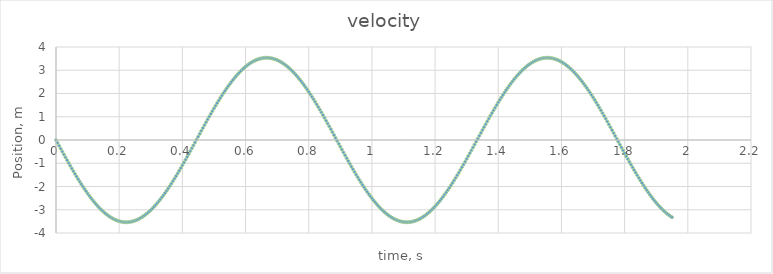
| Category | velocity |
|---|---|
| 0.0 | 0 |
| 0.005 | -0.125 |
| 0.01 | -0.25 |
| 0.015 | -0.374 |
| 0.02 | -0.498 |
| 0.025 | -0.622 |
| 0.030000000000000002 | -0.745 |
| 0.035 | -0.866 |
| 0.04 | -0.987 |
| 0.045 | -1.106 |
| 0.049999999999999996 | -1.224 |
| 0.05499999999999999 | -1.341 |
| 0.05999999999999999 | -1.456 |
| 0.06499999999999999 | -1.569 |
| 0.06999999999999999 | -1.68 |
| 0.075 | -1.789 |
| 0.08 | -1.895 |
| 0.085 | -2 |
| 0.09000000000000001 | -2.102 |
| 0.09500000000000001 | -2.201 |
| 0.10000000000000002 | -2.297 |
| 0.10500000000000002 | -2.391 |
| 0.11000000000000003 | -2.481 |
| 0.11500000000000003 | -2.569 |
| 0.12000000000000004 | -2.653 |
| 0.12500000000000003 | -2.734 |
| 0.13000000000000003 | -2.812 |
| 0.13500000000000004 | -2.886 |
| 0.14000000000000004 | -2.956 |
| 0.14500000000000005 | -3.023 |
| 0.15000000000000005 | -3.086 |
| 0.15500000000000005 | -3.145 |
| 0.16000000000000006 | -3.2 |
| 0.16500000000000006 | -3.251 |
| 0.17000000000000007 | -3.299 |
| 0.17500000000000007 | -3.341 |
| 0.18000000000000008 | -3.38 |
| 0.18500000000000008 | -3.415 |
| 0.19000000000000009 | -3.445 |
| 0.1950000000000001 | -3.471 |
| 0.2000000000000001 | -3.493 |
| 0.2050000000000001 | -3.51 |
| 0.2100000000000001 | -3.523 |
| 0.2150000000000001 | -3.532 |
| 0.2200000000000001 | -3.536 |
| 0.22500000000000012 | -3.535 |
| 0.23000000000000012 | -3.531 |
| 0.23500000000000013 | -3.521 |
| 0.24000000000000013 | -3.508 |
| 0.24500000000000013 | -3.49 |
| 0.2500000000000001 | -3.468 |
| 0.2550000000000001 | -3.441 |
| 0.2600000000000001 | -3.41 |
| 0.2650000000000001 | -3.375 |
| 0.27000000000000013 | -3.335 |
| 0.27500000000000013 | -3.292 |
| 0.28000000000000014 | -3.244 |
| 0.28500000000000014 | -3.192 |
| 0.29000000000000015 | -3.137 |
| 0.29500000000000015 | -3.077 |
| 0.30000000000000016 | -3.013 |
| 0.30500000000000016 | -2.946 |
| 0.31000000000000016 | -2.875 |
| 0.31500000000000017 | -2.801 |
| 0.3200000000000002 | -2.723 |
| 0.3250000000000002 | -2.641 |
| 0.3300000000000002 | -2.556 |
| 0.3350000000000002 | -2.468 |
| 0.3400000000000002 | -2.377 |
| 0.3450000000000002 | -2.283 |
| 0.3500000000000002 | -2.186 |
| 0.3550000000000002 | -2.087 |
| 0.3600000000000002 | -1.985 |
| 0.3650000000000002 | -1.88 |
| 0.3700000000000002 | -1.773 |
| 0.3750000000000002 | -1.664 |
| 0.3800000000000002 | -1.552 |
| 0.38500000000000023 | -1.439 |
| 0.39000000000000024 | -1.324 |
| 0.39500000000000024 | -1.207 |
| 0.40000000000000024 | -1.089 |
| 0.40500000000000025 | -0.969 |
| 0.41000000000000025 | -0.848 |
| 0.41500000000000026 | -0.727 |
| 0.42000000000000026 | -0.604 |
| 0.42500000000000027 | -0.48 |
| 0.43000000000000027 | -0.356 |
| 0.4350000000000003 | -0.232 |
| 0.4400000000000003 | -0.107 |
| 0.4450000000000003 | 0.018 |
| 0.4500000000000003 | 0.143 |
| 0.4550000000000003 | 0.268 |
| 0.4600000000000003 | 0.393 |
| 0.4650000000000003 | 0.517 |
| 0.4700000000000003 | 0.64 |
| 0.4750000000000003 | 0.762 |
| 0.4800000000000003 | 0.884 |
| 0.4850000000000003 | 1.005 |
| 0.4900000000000003 | 1.124 |
| 0.49500000000000033 | 1.242 |
| 0.5000000000000003 | 1.358 |
| 0.5050000000000003 | 1.472 |
| 0.5100000000000003 | 1.585 |
| 0.5150000000000003 | 1.696 |
| 0.5200000000000004 | 1.805 |
| 0.5250000000000004 | 1.911 |
| 0.5300000000000004 | 2.015 |
| 0.5350000000000004 | 2.116 |
| 0.5400000000000004 | 2.215 |
| 0.5450000000000004 | 2.311 |
| 0.5500000000000004 | 2.404 |
| 0.5550000000000004 | 2.495 |
| 0.5600000000000004 | 2.582 |
| 0.5650000000000004 | 2.665 |
| 0.5700000000000004 | 2.746 |
| 0.5750000000000004 | 2.823 |
| 0.5800000000000004 | 2.896 |
| 0.5850000000000004 | 2.966 |
| 0.5900000000000004 | 3.032 |
| 0.5950000000000004 | 3.095 |
| 0.6000000000000004 | 3.153 |
| 0.6050000000000004 | 3.208 |
| 0.6100000000000004 | 3.259 |
| 0.6150000000000004 | 3.305 |
| 0.6200000000000004 | 3.347 |
| 0.6250000000000004 | 3.386 |
| 0.6300000000000004 | 3.42 |
| 0.6350000000000005 | 3.449 |
| 0.6400000000000005 | 3.475 |
| 0.6450000000000005 | 3.496 |
| 0.6500000000000005 | 3.512 |
| 0.6550000000000005 | 3.525 |
| 0.6600000000000005 | 3.532 |
| 0.6650000000000005 | 3.536 |
| 0.6700000000000005 | 3.535 |
| 0.6750000000000005 | 3.53 |
| 0.6800000000000005 | 3.52 |
| 0.6850000000000005 | 3.506 |
| 0.6900000000000005 | 3.487 |
| 0.6950000000000005 | 3.464 |
| 0.7000000000000005 | 3.437 |
| 0.7050000000000005 | 3.405 |
| 0.7100000000000005 | 3.369 |
| 0.7150000000000005 | 3.329 |
| 0.7200000000000005 | 3.285 |
| 0.7250000000000005 | 3.237 |
| 0.7300000000000005 | 3.184 |
| 0.7350000000000005 | 3.128 |
| 0.7400000000000005 | 3.068 |
| 0.7450000000000006 | 3.004 |
| 0.7500000000000006 | 2.936 |
| 0.7550000000000006 | 2.864 |
| 0.7600000000000006 | 2.789 |
| 0.7650000000000006 | 2.711 |
| 0.7700000000000006 | 2.629 |
| 0.7750000000000006 | 2.544 |
| 0.7800000000000006 | 2.455 |
| 0.7850000000000006 | 2.364 |
| 0.7900000000000006 | 2.269 |
| 0.7950000000000006 | 2.172 |
| 0.8000000000000006 | 2.072 |
| 0.8050000000000006 | 1.969 |
| 0.8100000000000006 | 1.864 |
| 0.8150000000000006 | 1.757 |
| 0.8200000000000006 | 1.647 |
| 0.8250000000000006 | 1.536 |
| 0.8300000000000006 | 1.422 |
| 0.8350000000000006 | 1.307 |
| 0.8400000000000006 | 1.19 |
| 0.8450000000000006 | 1.071 |
| 0.8500000000000006 | 0.952 |
| 0.8550000000000006 | 0.831 |
| 0.8600000000000007 | 0.709 |
| 0.8650000000000007 | 0.586 |
| 0.8700000000000007 | 0.462 |
| 0.8750000000000007 | 0.338 |
| 0.8800000000000007 | 0.213 |
| 0.8850000000000007 | 0.088 |
| 0.8900000000000007 | -0.037 |
| 0.8950000000000007 | -0.162 |
| 0.9000000000000007 | -0.286 |
| 0.9050000000000007 | -0.411 |
| 0.9100000000000007 | -0.535 |
| 0.9150000000000007 | -0.658 |
| 0.9200000000000007 | -0.78 |
| 0.9250000000000007 | -0.902 |
| 0.9300000000000007 | -1.022 |
| 0.9350000000000007 | -1.141 |
| 0.9400000000000007 | -1.259 |
| 0.9450000000000007 | -1.375 |
| 0.9500000000000007 | -1.489 |
| 0.9550000000000007 | -1.602 |
| 0.9600000000000007 | -1.712 |
| 0.9650000000000007 | -1.82 |
| 0.9700000000000008 | -1.926 |
| 0.9750000000000008 | -2.03 |
| 0.9800000000000008 | -2.131 |
| 0.9850000000000008 | -2.229 |
| 0.9900000000000008 | -2.325 |
| 0.9950000000000008 | -2.418 |
| 1.0000000000000007 | -2.508 |
| 1.0050000000000006 | -2.594 |
| 1.0100000000000005 | -2.677 |
| 1.0150000000000003 | -2.757 |
| 1.0200000000000002 | -2.834 |
| 1.0250000000000001 | -2.907 |
| 1.03 | -2.976 |
| 1.035 | -3.042 |
| 1.0399999999999998 | -3.104 |
| 1.0449999999999997 | -3.162 |
| 1.0499999999999996 | -3.216 |
| 1.0549999999999995 | -3.266 |
| 1.0599999999999994 | -3.312 |
| 1.0649999999999993 | -3.353 |
| 1.0699999999999992 | -3.391 |
| 1.074999999999999 | -3.424 |
| 1.079999999999999 | -3.453 |
| 1.0849999999999989 | -3.478 |
| 1.0899999999999987 | -3.498 |
| 1.0949999999999986 | -3.514 |
| 1.0999999999999985 | -3.526 |
| 1.1049999999999984 | -3.533 |
| 1.1099999999999983 | -3.536 |
| 1.1149999999999982 | -3.534 |
| 1.119999999999998 | -3.528 |
| 1.124999999999998 | -3.518 |
| 1.129999999999998 | -3.503 |
| 1.1349999999999978 | -3.484 |
| 1.1399999999999977 | -3.46 |
| 1.1449999999999976 | -3.432 |
| 1.1499999999999975 | -3.4 |
| 1.1549999999999974 | -3.364 |
| 1.1599999999999973 | -3.323 |
| 1.1649999999999971 | -3.278 |
| 1.169999999999997 | -3.229 |
| 1.174999999999997 | -3.176 |
| 1.1799999999999968 | -3.119 |
| 1.1849999999999967 | -3.059 |
| 1.1899999999999966 | -2.994 |
| 1.1949999999999965 | -2.926 |
| 1.1999999999999964 | -2.854 |
| 1.2049999999999963 | -2.778 |
| 1.2099999999999962 | -2.699 |
| 1.214999999999996 | -2.616 |
| 1.219999999999996 | -2.531 |
| 1.2249999999999959 | -2.442 |
| 1.2299999999999958 | -2.35 |
| 1.2349999999999957 | -2.255 |
| 1.2399999999999956 | -2.157 |
| 1.2449999999999954 | -2.057 |
| 1.2499999999999953 | -1.954 |
| 1.2549999999999952 | -1.849 |
| 1.2599999999999951 | -1.741 |
| 1.264999999999995 | -1.631 |
| 1.269999999999995 | -1.519 |
| 1.2749999999999948 | -1.405 |
| 1.2799999999999947 | -1.29 |
| 1.2849999999999946 | -1.173 |
| 1.2899999999999945 | -1.054 |
| 1.2949999999999944 | -0.934 |
| 1.2999999999999943 | -0.813 |
| 1.3049999999999942 | -0.691 |
| 1.309999999999994 | -0.568 |
| 1.314999999999994 | -0.444 |
| 1.3199999999999938 | -0.32 |
| 1.3249999999999937 | -0.195 |
| 1.3299999999999936 | -0.07 |
| 1.3349999999999935 | 0.055 |
| 1.3399999999999934 | 0.18 |
| 1.3449999999999933 | 0.305 |
| 1.3499999999999932 | 0.429 |
| 1.354999999999993 | 0.553 |
| 1.359999999999993 | 0.676 |
| 1.3649999999999929 | 0.798 |
| 1.3699999999999928 | 0.92 |
| 1.3749999999999927 | 1.04 |
| 1.3799999999999926 | 1.159 |
| 1.3849999999999925 | 1.276 |
| 1.3899999999999924 | 1.392 |
| 1.3949999999999922 | 1.506 |
| 1.3999999999999921 | 1.618 |
| 1.404999999999992 | 1.728 |
| 1.409999999999992 | 1.836 |
| 1.4149999999999918 | 1.942 |
| 1.4199999999999917 | 2.045 |
| 1.4249999999999916 | 2.146 |
| 1.4299999999999915 | 2.244 |
| 1.4349999999999914 | 2.339 |
| 1.4399999999999913 | 2.431 |
| 1.4449999999999912 | 2.52 |
| 1.449999999999991 | 2.607 |
| 1.454999999999991 | 2.689 |
| 1.4599999999999909 | 2.769 |
| 1.4649999999999908 | 2.845 |
| 1.4699999999999906 | 2.917 |
| 1.4749999999999905 | 2.986 |
| 1.4799999999999904 | 3.051 |
| 1.4849999999999903 | 3.112 |
| 1.4899999999999902 | 3.17 |
| 1.4949999999999901 | 3.223 |
| 1.49999999999999 | 3.273 |
| 1.50499999999999 | 3.318 |
| 1.5099999999999898 | 3.359 |
| 1.5149999999999897 | 3.396 |
| 1.5199999999999896 | 3.429 |
| 1.5249999999999895 | 3.457 |
| 1.5299999999999894 | 3.481 |
| 1.5349999999999893 | 3.501 |
| 1.5399999999999892 | 3.516 |
| 1.544999999999989 | 3.527 |
| 1.549999999999989 | 3.534 |
| 1.5549999999999888 | 3.536 |
| 1.5599999999999887 | 3.534 |
| 1.5649999999999886 | 3.527 |
| 1.5699999999999885 | 3.516 |
| 1.5749999999999884 | 3.501 |
| 1.5799999999999883 | 3.481 |
| 1.5849999999999882 | 3.456 |
| 1.589999999999988 | 3.428 |
| 1.594999999999988 | 3.395 |
| 1.5999999999999879 | 3.358 |
| 1.6049999999999878 | 3.317 |
| 1.6099999999999877 | 3.271 |
| 1.6149999999999876 | 3.222 |
| 1.6199999999999875 | 3.168 |
| 1.6249999999999873 | 3.111 |
| 1.6299999999999872 | 3.049 |
| 1.6349999999999871 | 2.984 |
| 1.639999999999987 | 2.915 |
| 1.644999999999987 | 2.843 |
| 1.6499999999999868 | 2.767 |
| 1.6549999999999867 | 2.687 |
| 1.6599999999999866 | 2.604 |
| 1.6649999999999865 | 2.518 |
| 1.6699999999999864 | 2.429 |
| 1.6749999999999863 | 2.336 |
| 1.6799999999999862 | 2.241 |
| 1.684999999999986 | 2.143 |
| 1.689999999999986 | 2.042 |
| 1.6949999999999859 | 1.939 |
| 1.6999999999999857 | 1.833 |
| 1.7049999999999856 | 1.725 |
| 1.7099999999999855 | 1.615 |
| 1.7149999999999854 | 1.503 |
| 1.7199999999999853 | 1.388 |
| 1.7249999999999852 | 1.273 |
| 1.729999999999985 | 1.155 |
| 1.734999999999985 | 1.036 |
| 1.739999999999985 | 0.916 |
| 1.7449999999999848 | 0.795 |
| 1.7499999999999847 | 0.673 |
| 1.7549999999999846 | 0.549 |
| 1.7599999999999845 | 0.426 |
| 1.7649999999999844 | 0.301 |
| 1.7699999999999843 | 0.176 |
| 1.7749999999999841 | 0.052 |
| 1.779999999999984 | -0.073 |
| 1.784999999999984 | -0.198 |
| 1.7899999999999838 | -0.323 |
| 1.7949999999999837 | -0.447 |
| 1.7999999999999836 | -0.571 |
| 1.8049999999999835 | -0.694 |
| 1.8099999999999834 | -0.816 |
| 1.8149999999999833 | -0.937 |
| 1.8199999999999832 | -1.057 |
| 1.824999999999983 | -1.176 |
| 1.829999999999983 | -1.293 |
| 1.8349999999999829 | -1.409 |
| 1.8399999999999828 | -1.522 |
| 1.8449999999999827 | -1.634 |
| 1.8499999999999825 | -1.744 |
| 1.8549999999999824 | -1.852 |
| 1.8599999999999823 | -1.957 |
| 1.8649999999999822 | -2.06 |
| 1.8699999999999821 | -2.16 |
| 1.874999999999982 | -2.258 |
| 1.879999999999982 | -2.353 |
| 1.8849999999999818 | -2.444 |
| 1.8899999999999817 | -2.533 |
| 1.8949999999999816 | -2.619 |
| 1.8999999999999815 | -2.701 |
| 1.9049999999999814 | -2.78 |
| 1.9099999999999813 | -2.856 |
| 1.9149999999999812 | -2.928 |
| 1.919999999999981 | -2.996 |
| 1.924999999999981 | -3.06 |
| 1.9299999999999808 | -3.121 |
| 1.9349999999999807 | -3.178 |
| 1.9399999999999806 | -3.231 |
| 1.9449999999999805 | -3.28 |
| 1.9499999999999804 | -3.324 |